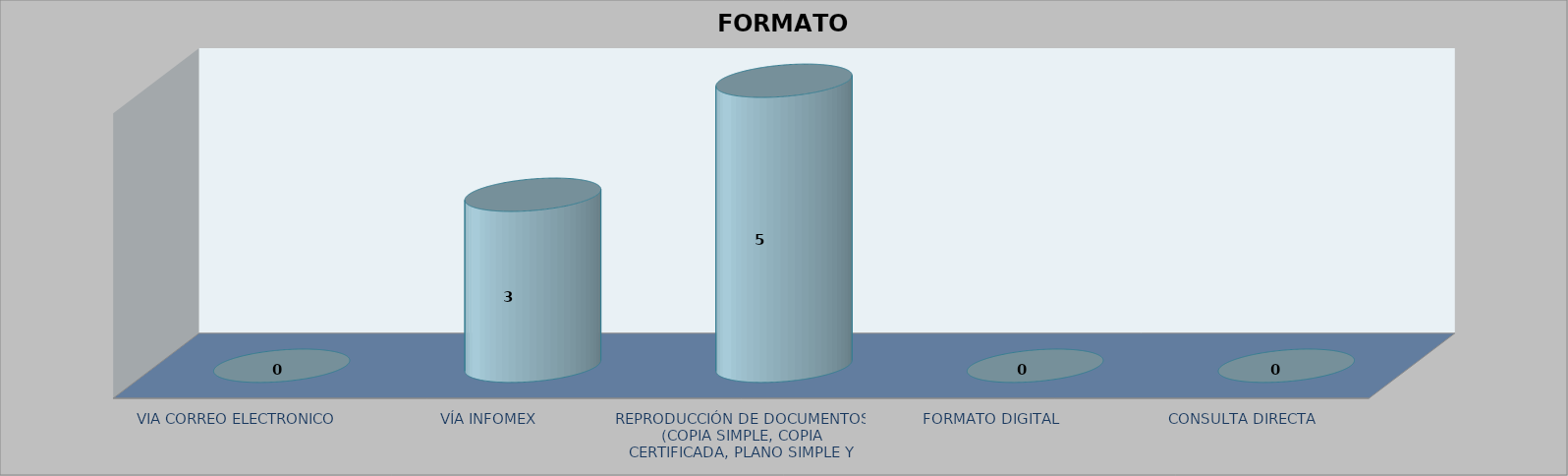
| Category |        FORMATO SOLICITADO | Series 1 | Series 2 |
|---|---|---|---|
| VIA CORREO ELECTRONICO |  |  | 0 |
| VÍA INFOMEX |  |  | 3 |
| REPRODUCCIÓN DE DOCUMENTOS (COPIA SIMPLE, COPIA CERTIFICADA, PLANO SIMPLE Y PLANO CERTIFICADO) |  |  | 5 |
| FORMATO DIGITAL |  |  | 0 |
| CONSULTA DIRECTA |  |  | 0 |